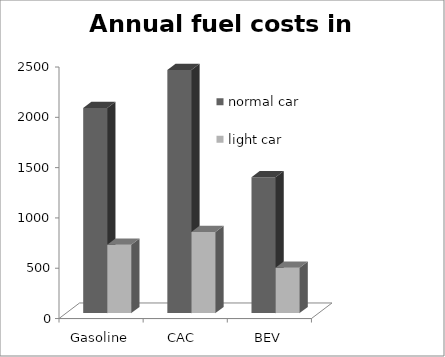
| Category | normal car | light car |
|---|---|---|
| Gasoline | 2037.969 | 679.323 |
| CAC  | 2416.023 | 805.341 |
| BEV | 1351.199 | 450.4 |